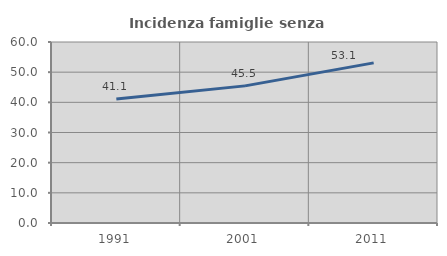
| Category | Incidenza famiglie senza nuclei |
|---|---|
| 1991.0 | 41.071 |
| 2001.0 | 45.455 |
| 2011.0 | 53.077 |